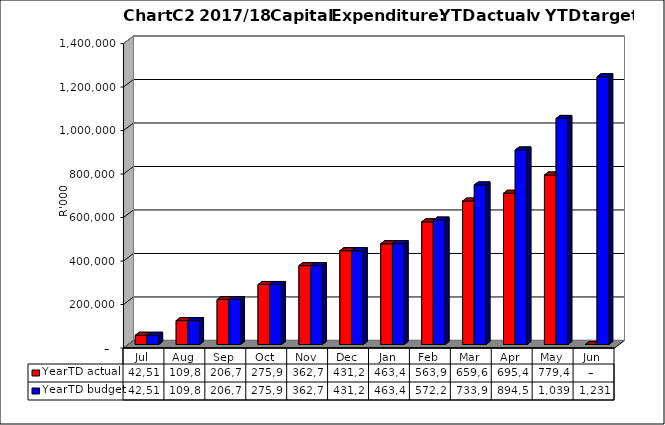
| Category | YearTD actual | YearTD budget |
|---|---|---|
| Jul | 42514077.958 | 42514077.958 |
| Aug | 109819163.669 | 109819163.669 |
| Sep | 206746264.689 | 206746264.689 |
| Oct | 275937386.544 | 275937386.544 |
| Nov | 362773276.763 | 362773276.763 |
| Dec | 431298740.768 | 431298740.768 |
| Jan | 463452466.218 | 463452466.218 |
| Feb | 563936706.923 | 572212754.825 |
| Mar | 659688353.972 | 733969291.597 |
| Apr | 695435817.937 | 894540462.807 |
| May | 779416008.645 | 1039622462.807 |
| Jun | 0 | 1231378999.579 |